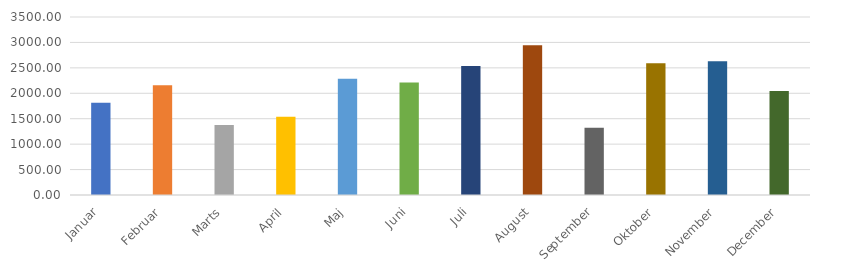
| Category | Series 0 |
|---|---|
| Januar | 1812.79 |
| Februar | 2160.08 |
| Marts | 1374.85 |
| April | 1539.81 |
| Maj | 2287.4 |
| Juni | 2211.2 |
| Juli | 2534.64 |
| August | 2943.57 |
| September | 1320.88 |
| Oktober | 2590.78 |
| November | 2630.08 |
| December | 2044.29 |